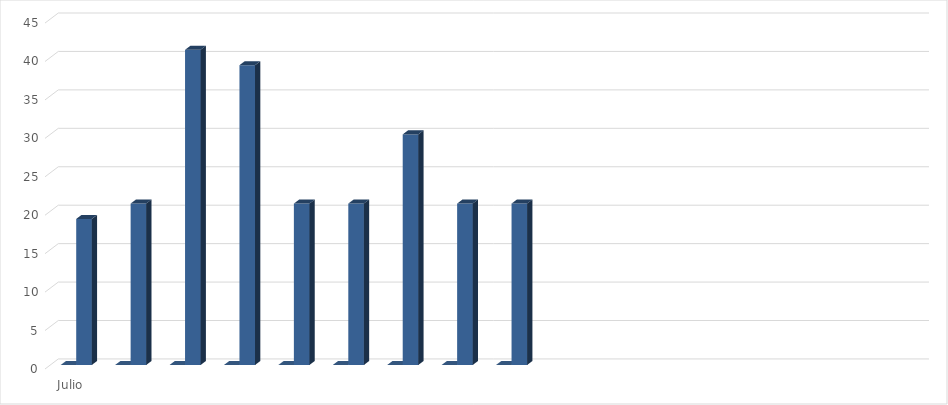
| Category | Series 0 | Series 1 |
|---|---|---|
| Julio | 0 | 19 |